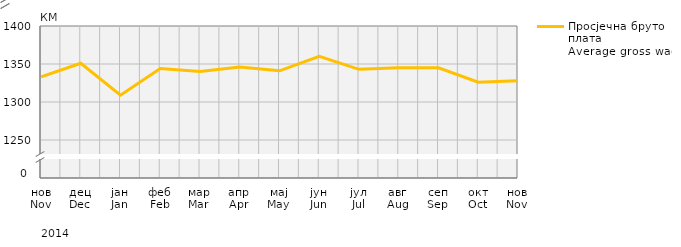
| Category | Просјечна бруто плата
Average gross wage |
|---|---|
| нов
Nov | 1333 |
| дец
Dec | 1351 |
| јан
Jan | 1309 |
| феб
Feb | 1344 |
| мар
Mar | 1340 |
| апр
Apr | 1346 |
| мај
May | 1341 |
| јун
Jun | 1360 |
| јул
Jul | 1343 |
| авг
Aug | 1345 |
| сеп
Sep | 1345 |
| окт
Oct | 1326 |
| нов
Nov | 1328 |